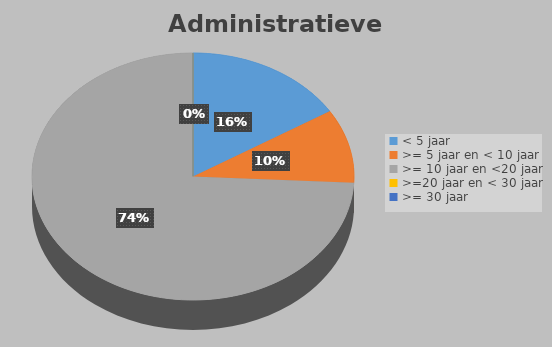
| Category | Series 0 |
|---|---|
| < 5 jaar | 0.161 |
| >= 5 jaar en < 10 jaar | 0.097 |
| >= 10 jaar en <20 jaar | 0.742 |
| >=20 jaar en < 30 jaar | 0 |
| >= 30 jaar | 0 |